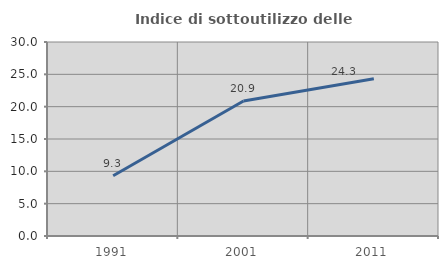
| Category | Indice di sottoutilizzo delle abitazioni  |
|---|---|
| 1991.0 | 9.326 |
| 2001.0 | 20.879 |
| 2011.0 | 24.317 |